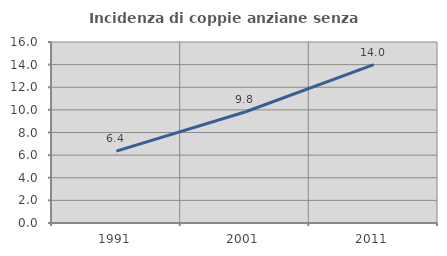
| Category | Incidenza di coppie anziane senza figli  |
|---|---|
| 1991.0 | 6.354 |
| 2001.0 | 9.814 |
| 2011.0 | 13.995 |